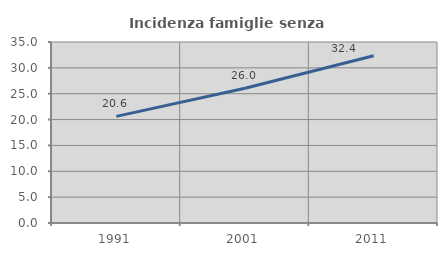
| Category | Incidenza famiglie senza nuclei |
|---|---|
| 1991.0 | 20.613 |
| 2001.0 | 26.043 |
| 2011.0 | 32.353 |